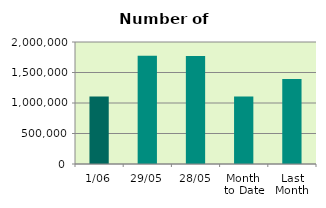
| Category | Series 0 |
|---|---|
| 1/06 | 1107566 |
| 29/05 | 1772994 |
| 28/05 | 1771880 |
| Month 
to Date | 1107566 |
| Last
Month | 1395416 |